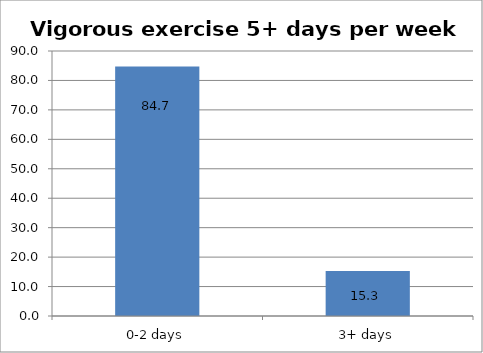
| Category | Series 0 |
|---|---|
| 0-2 days | 84.707 |
| 3+ days | 15.293 |